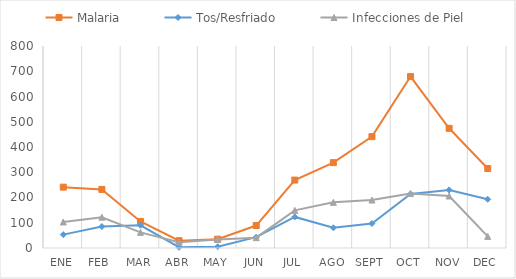
| Category | Malaria | Tos/Resfriado | Infecciones de Piel |
|---|---|---|---|
| ENE | 241 | 53 | 103 |
| FEB | 232 | 85 | 122 |
| MAR | 105 | 90 | 62 |
| ABR | 29 | 3 | 23 |
| MAY | 35 | 5 | 34 |
| JUN | 89 | 43 | 41 |
| JUL | 269 | 123 | 149 |
| AGO | 338 | 80 | 181 |
| SEPT | 441 | 97 | 190 |
| OCT | 679 | 214 | 216 |
| NOV | 474 | 230 | 206 |
| DEC | 315 | 193 | 46 |